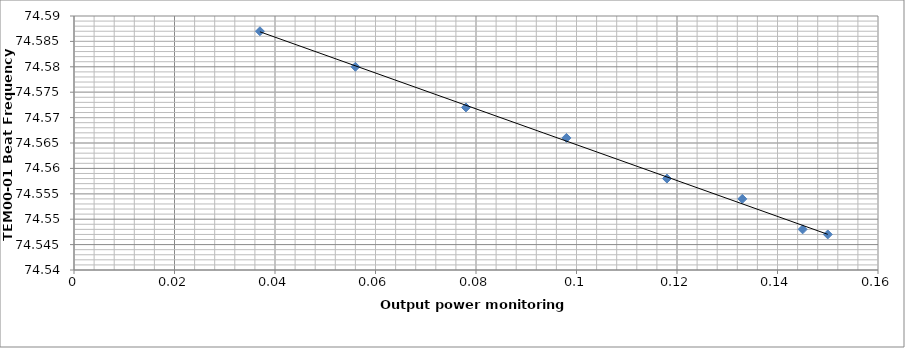
| Category | Series 0 |
|---|---|
| 0.15 | 74.547 |
| 0.145 | 74.548 |
| 0.133 | 74.554 |
| 0.118 | 74.558 |
| 0.098 | 74.566 |
| 0.078 | 74.572 |
| 0.056 | 74.58 |
| 0.037 | 74.587 |